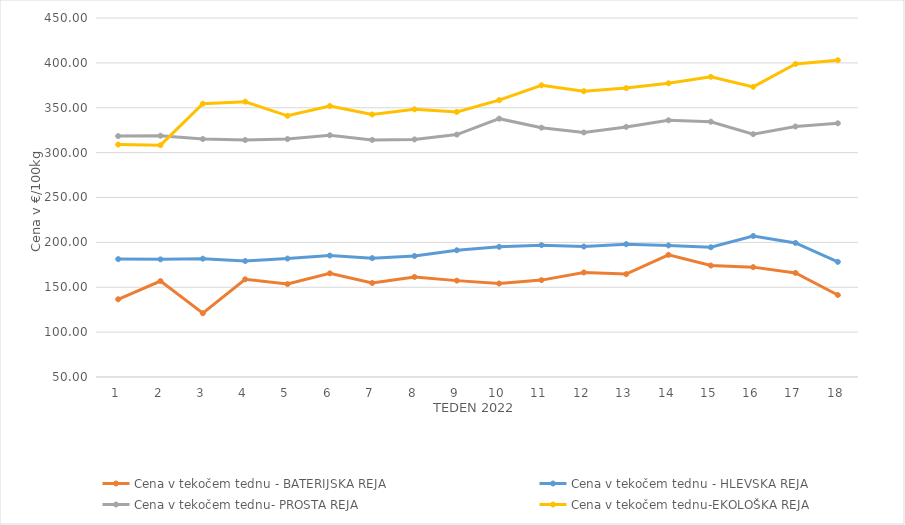
| Category | Cena v tekočem tednu - BATERIJSKA REJA | Cena v tekočem tednu - HLEVSKA REJA | Cena v tekočem tednu- PROSTA REJA | Cena v tekočem tednu-EKOLOŠKA REJA |
|---|---|---|---|---|
| 1.0 | 136.59 | 181.38 | 318.4 | 308.97 |
| 2.0 | 156.88 | 181.07 | 318.82 | 308.28 |
| 3.0 | 121.07 | 181.83 | 315.14 | 354.48 |
| 4.0 | 158.82 | 179.22 | 314.08 | 356.72 |
| 5.0 | 153.55 | 181.96 | 315.1 | 341.03 |
| 6.0 | 165.51 | 185.31 | 319.38 | 351.9 |
| 7.0 | 154.74 | 182.45 | 314.16 | 342.59 |
| 8.0 | 161.48 | 184.77 | 314.71 | 348.28 |
| 9.0 | 157.38 | 191.21 | 320.1 | 345.35 |
| 10.0 | 154.16 | 195.04 | 337.83 | 358.45 |
| 11.0 | 157.96 | 196.88 | 327.79 | 375 |
| 12.0 | 166.49 | 195.36 | 322.46 | 368.45 |
| 13.0 | 164.66 | 197.95 | 328.67 | 371.9 |
| 14.0 | 186.11 | 196.59 | 336.02 | 377.24 |
| 15.0 | 174.18 | 194.49 | 334.46 | 384.48 |
| 16.0 | 172.42 | 207.1 | 320.58 | 373.28 |
| 17.0 | 165.96 | 199.41 | 329.11 | 398.79 |
| 18.0 | 141.36 | 178.29 | 332.71 | 402.93 |